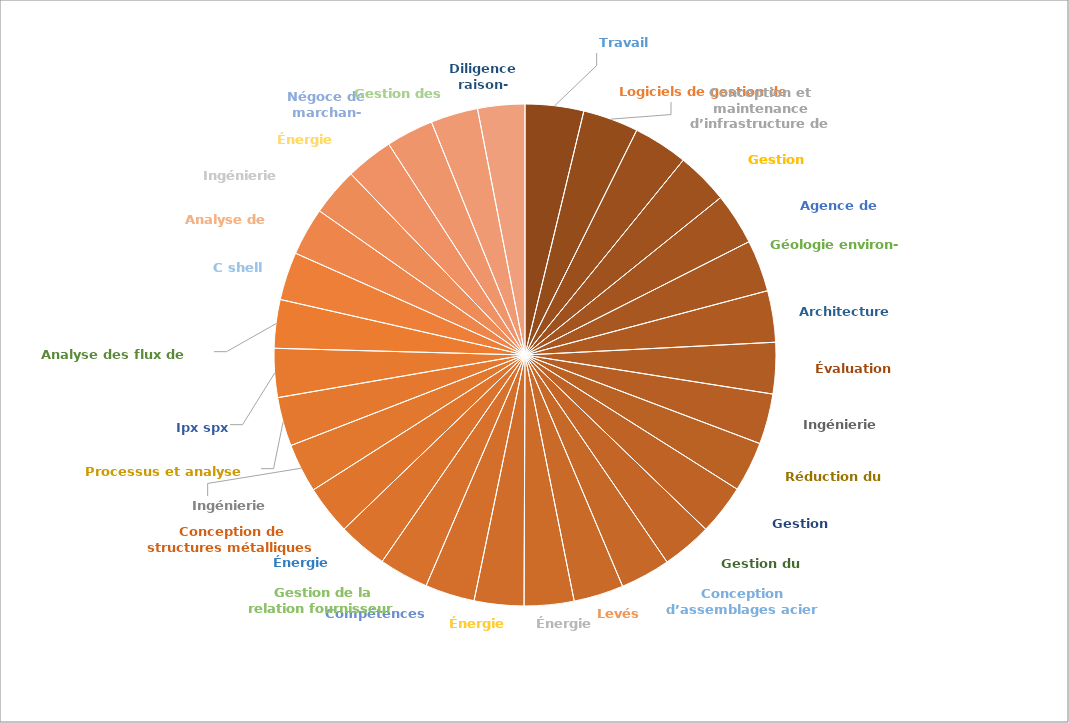
| Category | Series 0 |
|---|---|
| Travail environnemental | 0.687 |
| Logiciels de gestion de projets | 0.652 |
| Conception et maintenance d’infrastructure de services d’utilité publique | 0.641 |
| Gestion budgétaire | 0.613 |
| Agence de l’environnement | 0.608 |
| Géologie environ- 
nementale | 0.607 |
| Architecture verte | 0.604 |
| Évaluation d’impact | 0.602 |
| Ingénierie durable | 0.593 |
| Réduction du carbone | 0.59 |
| Gestion d’ingénierie | 0.59 |
| Gestion du carbone | 0.587 |
| Conception d’assemblages acier | 0.587 |
| Levés | 0.586 |
| Énergie hydrique | 0.584 |
| Énergie marémotrice | 0.583 |
| Compétences analytiques | 0.582 |
| Gestion de la relation fournisseur | 0.582 |
| Énergie propre | 0.579 |
| Conception de structures métalliques | 0.577 |
| Ingénierie sismique | 0.576 |
| Processus et analyse métier | 0.575 |
| Ipx spx | 0.574 |
| Analyse des flux de matières | 0.57 |
| C shell csh | 0.564 |
| Analyse de données | 0.563 |
| Ingénierie géotechnique | 0.562 |
| Énergie durable | 0.558 |
| Négoce de marchan-
dises | 0.558 |
| Gestion des données | 0.555 |
| Diligence raison-
nable | 0.553 |